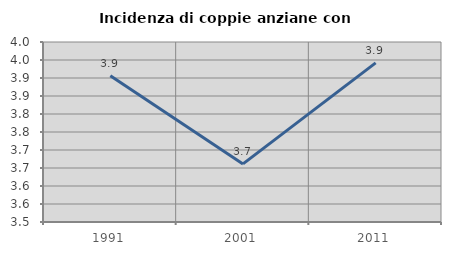
| Category | Incidenza di coppie anziane con figli |
|---|---|
| 1991.0 | 3.906 |
| 2001.0 | 3.661 |
| 2011.0 | 3.942 |